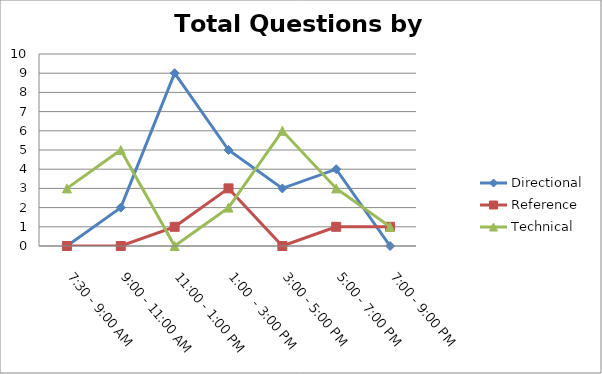
| Category | Directional | Reference | Technical |
|---|---|---|---|
| 7:30 - 9:00 AM | 0 | 0 | 3 |
| 9:00 - 11:00 AM | 2 | 0 | 5 |
| 11:00 - 1:00 PM | 9 | 1 | 0 |
| 1:00  - 3:00 PM | 5 | 3 | 2 |
| 3:00 - 5:00 PM | 3 | 0 | 6 |
| 5:00 - 7:00 PM | 4 | 1 | 3 |
| 7:00 - 9:00 PM | 0 | 1 | 1 |